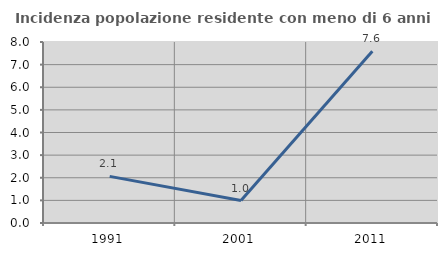
| Category | Incidenza popolazione residente con meno di 6 anni |
|---|---|
| 1991.0 | 2.062 |
| 2001.0 | 0.99 |
| 2011.0 | 7.595 |